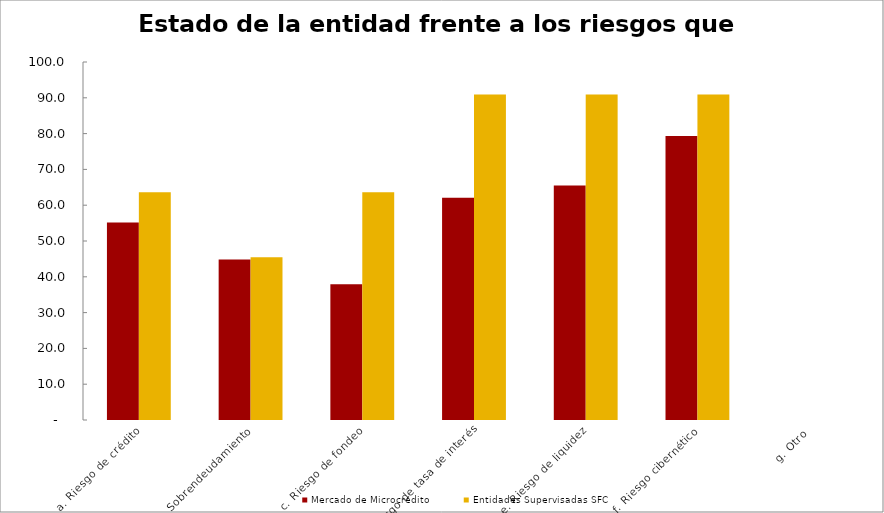
| Category | Mercado de Microcrédito | Entidades Supervisadas SFC |
|---|---|---|
| a. Riesgo de crédito | 55.172 | 63.636 |
| b. Sobrendeudamiento | 44.828 | 45.455 |
| c. Riesgo de fondeo | 37.931 | 63.636 |
| d. Riesgo de tasa de interés | 62.069 | 90.909 |
| e. Riesgo de liquidez | 65.517 | 90.909 |
| f. Riesgo cibernético | 79.31 | 90.909 |
| g. Otro | 0 | 0 |